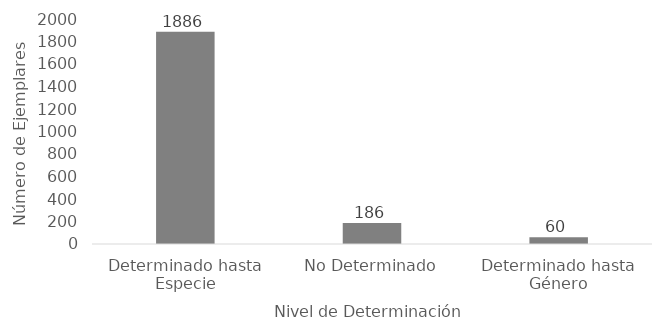
| Category | Series 0 |
|---|---|
| Determinado hasta Especie | 1886 |
| No Determinado | 186 |
| Determinado hasta Género | 60 |